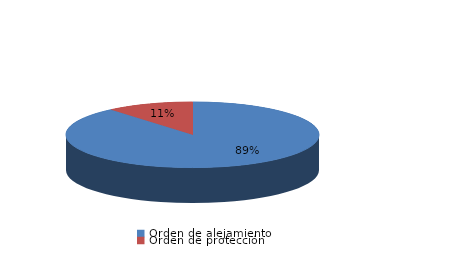
| Category | Series 0 |
|---|---|
| Orden de alejamiento | 16 |
| Orden de protección | 2 |